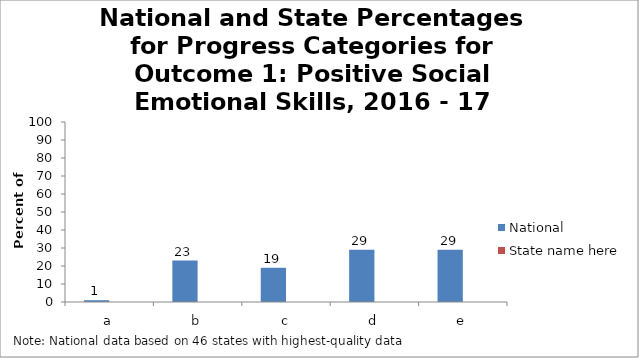
| Category | National | State name here |
|---|---|---|
| a | 1 |  |
| b | 23 |  |
| c | 19 |  |
| d | 29 |  |
| e | 29 |  |